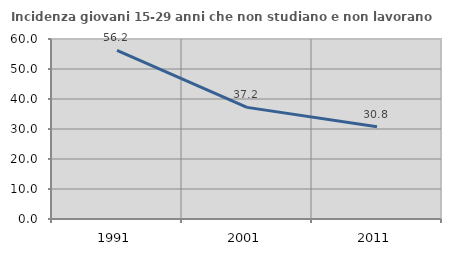
| Category | Incidenza giovani 15-29 anni che non studiano e non lavorano  |
|---|---|
| 1991.0 | 56.171 |
| 2001.0 | 37.214 |
| 2011.0 | 30.781 |